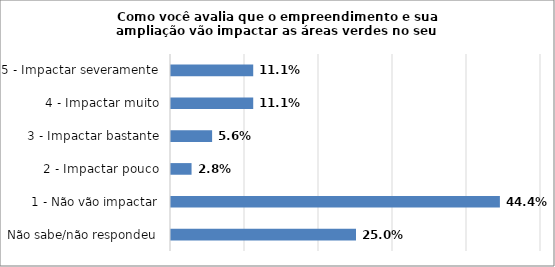
| Category | Series 0 |
|---|---|
| Não sabe/não respondeu | 0.25 |
| 1 - Não vão impactar | 0.444 |
| 2 - Impactar pouco | 0.028 |
| 3 - Impactar bastante | 0.056 |
| 4 - Impactar muito | 0.111 |
| 5 - Impactar severamente | 0.111 |